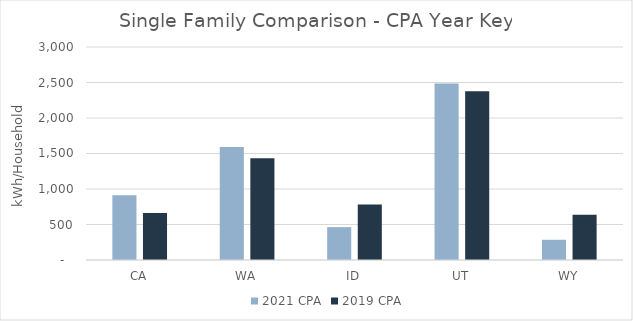
| Category | 2021 CPA | 2019 CPA |
|---|---|---|
|  CA  | 912.499 | 661.496 |
|  WA  | 1589.955 | 1434.16 |
|  ID  | 462.203 | 780.794 |
|  UT  | 2486.363 | 2375.989 |
|  WY  | 284.752 | 635.586 |